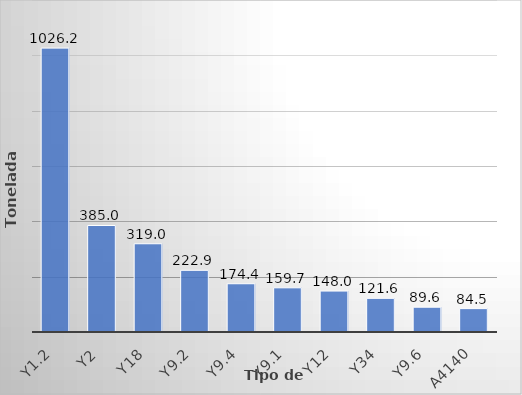
| Category | Series 0 |
|---|---|
| Y1.2 | 1026.161 |
| Y2 | 384.979 |
| Y18 | 318.968 |
| Y9.2 | 222.913 |
| Y9.4 | 174.415 |
| Y9.1 | 159.658 |
| Y12 | 147.995 |
| Y34 | 121.628 |
| Y9.6 | 89.612 |
| A4140 | 84.539 |